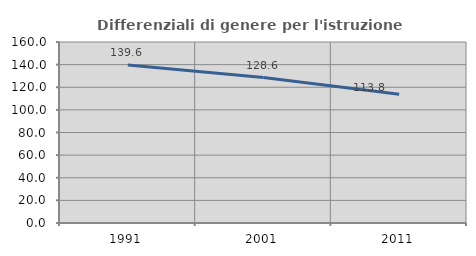
| Category | Differenziali di genere per l'istruzione superiore |
|---|---|
| 1991.0 | 139.592 |
| 2001.0 | 128.607 |
| 2011.0 | 113.763 |